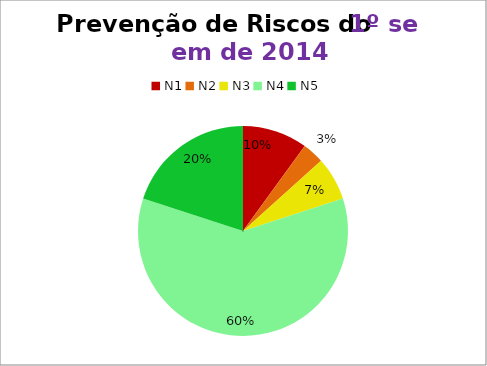
| Category | 1º/14 |
|---|---|
| N1 | 3 |
| N2 | 1 |
| N3 | 2 |
| N4 | 18 |
| N5 | 6 |